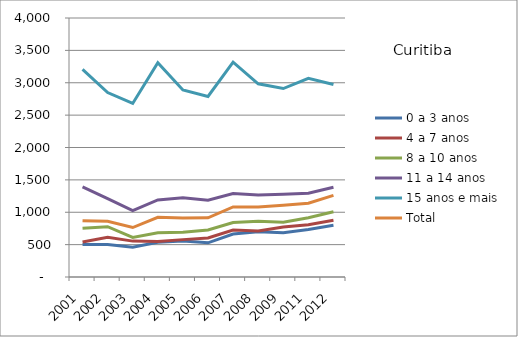
| Category | 0 a 3 anos | 4 a 7 anos | 8 a 10 anos | 11 a 14 anos | 15 anos e mais | Total |
|---|---|---|---|---|---|---|
| 2001.0 | 502.91 | 540.91 | 751.79 | 1392.8 | 3205.86 | 870.14 |
| 2002.0 | 501.89 | 614.52 | 777.39 | 1210.79 | 2848.67 | 859.34 |
| 2003.0 | 458.03 | 554.18 | 612.13 | 1025.07 | 2680.39 | 763.88 |
| 2004.0 | 536.69 | 548.02 | 683.52 | 1189.53 | 3310.41 | 922.52 |
| 2005.0 | 555.96 | 577.19 | 692.7 | 1225.08 | 2888.13 | 909.29 |
| 2006.0 | 527.49 | 603.67 | 724.99 | 1186.09 | 2787.66 | 914.75 |
| 2007.0 | 664.13 | 724.98 | 841.38 | 1289.02 | 3318.41 | 1081.61 |
| 2008.0 | 698.53 | 710.75 | 860.6 | 1267.64 | 2983.7 | 1082.9 |
| 2009.0 | 685.2 | 772.23 | 847.37 | 1277.18 | 2910.27 | 1107.85 |
| 2011.0 | 733.75 | 805.59 | 915.98 | 1294.05 | 3069.33 | 1140.13 |
| 2012.0 | 800.4 | 877.58 | 1007.18 | 1387.14 | 2972.71 | 1260.61 |